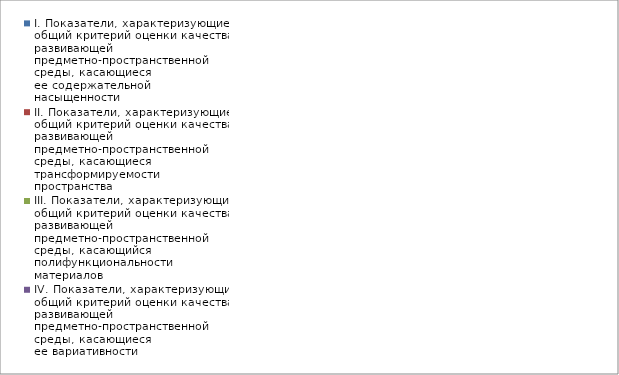
| Category | I. Показатели, характеризующие общий критерий оценки качества развивающей предметно-пространственной среды, касающиеся ее содержательной насыщенности | II. Показатели, характеризующие общий критерий оценки качества развивающей предметно-пространственной среды, касающиеся трансформируемости пространства | III. Показатели, характеризующие общий критерий оценки качества развивающей предметно-пространственной среды, касающийся полифункциональности материалов | IV. Показатели, характеризующие общий критерий оценки качества развивающей предметно-пространственной среды, касающиеся ее вариативности | V. Показатели, характеризующие общий критерий оценки качества развивающей предметно-пространственной среды, касающиеся ее доступности | VI. Показатели, характеризующие общий критерий оценки качества развивающей предметно-пространственной среды, касающиеся безопасности предметно-пространственной среды |
|---|---|---|---|---|---|---|
| Пчёлка | 0.909 | 0.833 | 0.667 | 1 | 0.9 | 1 |